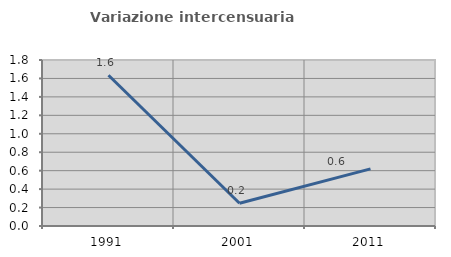
| Category | Variazione intercensuaria annua |
|---|---|
| 1991.0 | 1.635 |
| 2001.0 | 0.247 |
| 2011.0 | 0.619 |